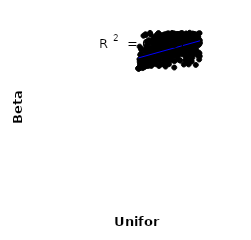
| Category | Series 0 |
|---|---|
| 151.58662230469125 | 36.958 |
| 117.02366175498116 | 36.734 |
| 141.4622938112055 | 40.559 |
| 140.04481939467075 | 40.18 |
| 138.54682849161816 | 40.958 |
| 114.3937213328714 | 36.178 |
| 111.9688835244239 | 38.92 |
| 154.23147277150008 | 43.843 |
| 108.42089313407557 | 37.828 |
| 121.60663631891065 | 41.712 |
| 137.001413410114 | 40.652 |
| 153.71407965694323 | 43.094 |
| 130.953628019818 | 42.838 |
| 137.8433108642392 | 40.185 |
| 114.67230462280449 | 39.768 |
| 139.254163358308 | 39.957 |
| 149.5701239956246 | 41.96 |
| 133.52875895147798 | 42.384 |
| 145.3219372055374 | 40.41 |
| 141.1928729245958 | 41.929 |
| 133.86503710598365 | 40.575 |
| 132.29333464374923 | 40.783 |
| 128.93570748829694 | 43.222 |
| 126.15059682240863 | 35.931 |
| 158.08882277802542 | 38.447 |
| 149.08031780903394 | 43.501 |
| 136.3329241079614 | 41.806 |
| 116.41255291665382 | 36.607 |
| 115.49649882743664 | 36.248 |
| 132.06005435090202 | 40.743 |
| 126.00508338681331 | 39.625 |
| 156.80155260295928 | 39.402 |
| 108.78196619002767 | 41.864 |
| 151.808604515911 | 37.595 |
| 123.06967446008183 | 39.716 |
| 106.119097633572 | 36.385 |
| 153.45562445195057 | 40.146 |
| 103.47065402841946 | 35.902 |
| 122.478109245833 | 41.161 |
| 140.60853881658528 | 37.248 |
| 146.70241842897883 | 37.664 |
| 123.92320524545396 | 41.364 |
| 134.06616891283485 | 40.7 |
| 148.60029297280818 | 38.226 |
| 124.88792561904154 | 41.711 |
| 116.85124174958747 | 42.204 |
| 159.60431633918424 | 37.382 |
| 132.47978972670376 | 37.848 |
| 147.92368566363774 | 43.501 |
| 107.35222295221547 | 37.355 |
| 155.34974182683015 | 39.546 |
| 122.96729861850233 | 43.194 |
| 146.87760657206462 | 38.073 |
| 151.44616522288106 | 43.726 |
| 143.60598700343752 | 42.263 |
| 127.3651615808546 | 42.853 |
| 146.13990437948104 | 42.087 |
| 122.13348809732918 | 42.696 |
| 146.3784054526746 | 37.079 |
| 141.87764462293603 | 42.322 |
| 121.03890436650336 | 37.799 |
| 140.9531317034082 | 39.445 |
| 125.52298814488245 | 43.625 |
| 101.32036258354088 | 35.166 |
| 109.46405868303056 | 36.621 |
| 150.81827046183284 | 38.688 |
| 148.25156817429348 | 43.401 |
| 124.29297364957225 | 38.643 |
| 121.47852402757475 | 37.128 |
| 109.98323734713952 | 36.441 |
| 149.7029855441926 | 41.361 |
| 105.4213727370216 | 37.964 |
| 138.2397512346903 | 38.256 |
| 101.08416524071903 | 35.099 |
| 125.84143945363542 | 39.577 |
| 135.90676135191632 | 36.977 |
| 119.35167467539978 | 39.095 |
| 135.36683302019281 | 44.036 |
| 121.93522390675261 | 42.847 |
| 128.16302346775868 | 41.893 |
| 120.30478521486637 | 40.391 |
| 148.55841964791068 | 43.418 |
| 139.4502643846024 | 43.343 |
| 124.57215566175644 | 41.257 |
| 155.64808240936648 | 42.203 |
| 118.53541247721753 | 37.561 |
| 151.02805538598574 | 40.163 |
| 115.71544281627449 | 43.051 |
| 132.82479306592532 | 39.31 |
| 129.536856654268 | 42.754 |
| 122.81125549736561 | 38.213 |
| 155.228358779723 | 43.28 |
| 117.45102276058799 | 43.11 |
| 130.78695648682475 | 37.688 |
| 132.42606245281831 | 43.86 |
| 154.66718948064377 | 43.889 |
| 122.06993177993553 | 36.077 |
| 122.67616287322589 | 43.271 |
| 119.07411628484087 | 41.328 |
| 121.13209332623866 | 39.186 |
| 115.0139581605669 | 38.938 |
| 137.30645537757508 | 40.554 |
| 100.91505817604192 | 35.085 |
| 158.91759964178874 | 41.066 |
| 147.45121055679738 | 42.581 |
| 155.90770291185535 | 39.507 |
| 138.12092981468908 | 38.429 |
| 132.11321418604717 | 39.7 |
| 133.10942454992232 | 40.707 |
| 101.88301232729307 | 37.423 |
| 157.27943849399426 | 43.338 |
| 125.75855081140696 | 39.265 |
| 126.89507557119879 | 37.765 |
| 144.94898320540008 | 41.273 |
| 155.75660786086172 | 42.966 |
| 141.65303355792307 | 39.434 |
| 105.91227618221703 | 36.683 |
| 122.35931852301326 | 42.035 |
| 130.08984277217016 | 38.406 |
| 128.75371361528977 | 40.583 |
| 148.34442213449796 | 36.384 |
| 103.22824038175337 | 36.424 |
| 139.5710368196299 | 43.862 |
| 106.19866203186267 | 37.254 |
| 134.2120527561547 | 39.104 |
| 136.60954237848986 | 38.317 |
| 140.8848481051661 | 40.164 |
| 149.44990854988134 | 36.124 |
| 103.5689535632133 | 38.934 |
| 112.2997307194285 | 37.173 |
| 102.05105420367123 | 40.662 |
| 135.13016491669896 | 42.687 |
| 121.72947291574019 | 39.742 |
| 114.1551923159175 | 36.516 |
| 117.58176020153672 | 41.784 |
| 111.1400867732507 | 39.104 |
| 127.99551988690257 | 41.738 |
| 145.1483697699441 | 39.191 |
| 159.54139163875584 | 42.187 |
| 142.59061412825744 | 41.559 |
| 141.9661062080536 | 44.06 |
| 154.03751815755416 | 42.443 |
| 115.99678716196627 | 37.905 |
| 117.06658627419644 | 37.037 |
| 136.98948004400904 | 41.297 |
| 129.86160509755555 | 36.64 |
| 159.94007260290758 | 44.093 |
| 158.36219606811042 | 41.966 |
| 119.19823053475498 | 38.119 |
| 101.69453446313864 | 35.288 |
| 131.20136207194668 | 42.562 |
| 106.77153111670388 | 35.916 |
| 119.21344259147436 | 43.74 |
| 132.62171707444702 | 40.7 |
| 107.97320202730913 | 37.195 |
| 130.54458588030832 | 42.969 |
| 132.76617391594007 | 41.32 |
| 158.75161663415227 | 42.535 |
| 149.2884276524941 | 41.208 |
| 142.67087117525335 | 39.92 |
| 128.776727026537 | 36.95 |
| 129.21576255670442 | 37.168 |
| 110.45973454655338 | 39.888 |
| 118.82158931655852 | 40.788 |
| 155.14307975481117 | 43.834 |
| 102.86289483667758 | 35.608 |
| 106.80786533695773 | 35.468 |
| 136.1520624337956 | 40.792 |
| 107.98709582020662 | 43.606 |
| 145.5447384408859 | 39.213 |
| 111.63172470300597 | 38.721 |
| 131.94282466953655 | 37.291 |
| 151.24526971229176 | 39.943 |
| 131.28352207647904 | 42.529 |
| 108.10698876845873 | 37.155 |
| 142.384537806102 | 41.425 |
| 147.0275089056367 | 37.154 |
| 111.86127096988542 | 37.477 |
| 159.6935308827816 | 41.778 |
| 124.6394364896577 | 40.632 |
| 101.22856795476362 | 35.132 |
| 154.48824002221357 | 38.811 |
| 102.6796128498152 | 38.578 |
| 151.42501608394292 | 43.326 |
| 116.47485469041813 | 41.063 |
| 143.31454226873524 | 42.847 |
| 131.5837180520668 | 38.534 |
| 151.9843090168883 | 36.975 |
| 146.9865219846219 | 44.015 |
| 124.74114544179774 | 40.018 |
| 139.8854285622441 | 38.929 |
| 104.87799833020475 | 36.168 |
| 117.68353442510812 | 40.145 |
| 136.86849508829016 | 39.257 |
| 126.1163610059692 | 43.312 |
| 102.75886771905466 | 37.46 |
| 108.88307221430803 | 36.747 |
| 104.28604480401643 | 36.099 |
| 119.69164034931637 | 41.161 |
| 146.55896577170574 | 40.883 |
| 108.57910453380097 | 37.763 |
| 112.55155848390957 | 37.416 |
| 150.66865035448015 | 40.973 |
| 144.0391511356472 | 41.708 |
| 148.97475151033112 | 41.59 |
| 120.06832395483562 | 38.348 |
| 135.52565173964638 | 35.332 |
| 105.13433688975967 | 36.273 |
| 156.68898704405944 | 42.665 |
| 107.4641051427658 | 36.514 |
| 115.88266439122606 | 42.629 |
| 105.52040745329293 | 36.626 |
| 159.27073215997785 | 42.409 |
| 144.82081853217642 | 42.856 |
| 137.40536454544448 | 40.584 |
| 145.03690880720325 | 40.189 |
| 149.41157461268003 | 36.67 |
| 130.34523707450177 | 36.18 |
| 120.58227557123203 | 40.55 |
| 153.53704914871014 | 42.871 |
| 104.10844050002189 | 37.213 |
| 157.7528754016516 | 41.414 |
| 125.33114210948762 | 39.316 |
| 156.3529066017246 | 35.992 |
| 101.60911180769003 | 35.153 |
| 147.86053559737093 | 41.001 |
| 146.00756736160918 | 38.716 |
| 101.04794908447339 | 35.09 |
| 102.44019355268856 | 35.224 |
| 140.36443142746202 | 42.653 |
| 111.33051793177951 | 40.202 |
| 121.36159193319575 | 41.195 |
| 113.7613741652395 | 35.968 |
| 133.9451738078719 | 39.194 |
| 106.02010013860895 | 36.036 |
| 151.72344877473142 | 41.759 |
| 112.16403177068868 | 40.433 |
| 156.03836996703842 | 43.444 |
| 145.89173439174172 | 42.306 |
| 124.18675312598836 | 41.045 |
| 146.54204203601066 | 41.965 |
| 152.53815283697418 | 40.886 |
| 148.76331314143061 | 42.532 |
| 109.04998482882917 | 36.374 |
| 116.31731616096403 | 37.483 |
| 144.32363249311416 | 38.866 |
| 125.10962526140716 | 42.03 |
| 106.64842911444917 | 36.102 |
| 159.15405430744212 | 39.151 |
| 115.0645010266322 | 40.298 |
| 128.63451063854936 | 41.504 |
| 107.02497617564624 | 36.135 |
| 156.9987948611144 | 39.285 |
| 108.62918196361302 | 40.805 |
| 112.83413286802195 | 39.043 |
| 104.47012626205924 | 37.95 |
| 157.99229981088854 | 42.8 |
| 103.44378169799246 | 39.993 |
| 143.91208676304097 | 43.624 |
| 134.3313529445006 | 42.408 |
| 117.98666725209506 | 41.212 |
| 127.47301114547506 | 40.934 |
| 144.5896295935416 | 43.146 |
| 159.39517808076454 | 41.163 |
| 123.80702717776896 | 40.776 |
| 126.42959940760788 | 37.2 |
| 152.87164305397562 | 40.479 |
| 152.29694889991072 | 36.868 |
| 138.00267017168446 | 43.879 |
| 147.71734470011177 | 39.409 |
| 128.51313228624704 | 43.961 |
| 134.54359247682183 | 37.109 |
| 154.32031144387088 | 43.282 |
| 113.28330038448901 | 35.735 |
| 137.80695574385007 | 43.271 |
| 117.84844435556225 | 37.788 |
| 150.49166413547758 | 38.899 |
| 154.73209927270094 | 40.19 |
| 104.2376494493162 | 36.557 |
| 112.40763091253643 | 36.855 |
| 137.15571214418208 | 39.491 |
| 118.33784833503339 | 42.667 |
| 119.5955484436477 | 39.157 |
| 145.82470642191197 | 43.232 |
| 140.1284742937491 | 40.859 |
| 111.23096308346372 | 36.186 |
| 137.56502878816124 | 41.73 |
| 156.1489961637179 | 41.766 |
| 153.0476929972122 | 37.848 |
| 129.81572902736866 | 44.053 |
| 113.58554847370158 | 39.347 |
| 155.50730411764897 | 42.263 |
| 133.0084179979695 | 42.058 |
| 124.42445230178612 | 38.022 |
| 130.5628502262545 | 40.622 |
| 129.27961320887624 | 41.315 |
| 116.77300861772481 | 39.926 |
| 145.66337480132063 | 42.399 |
| 157.39693064652494 | 41.788 |
| 117.38904242688703 | 37.082 |
| 142.1092193065715 | 42.913 |
| 140.28163999942444 | 40.953 |
| 156.26547448980057 | 40.781 |
| 110.30207943499673 | 41.354 |
| 111.77780769575556 | 38.714 |
| 114.0277222666988 | 36.391 |
| 126.55467154412975 | 38.159 |
| 112.92803273654502 | 39.811 |
| 121.3219741327282 | 39.871 |
| 107.68848305174687 | 43.805 |
| 124.09846688490065 | 36.306 |
| 127.57820745678903 | 40.68 |
| 151.11223722579598 | 41.352 |
| 127.25711718678212 | 39.86 |
| 160.21212414338694 | 42.233 |
| 157.5807296088554 | 42.842 |
| 153.63560264320523 | 39.37 |
| 105.24904382990684 | 36.002 |
| 139.67386949895698 | 43.821 |
| 110.53294410956296 | 41.816 |
| 136.75285838885887 | 39.755 |
| 122.2791391047895 | 36.251 |
| 107.13900301049422 | 39.456 |
| 142.87093370320554 | 41.464 |
| 150.9564026856488 | 39.22 |
| 118.18104156315579 | 37.365 |
| 109.17230062886117 | 35.898 |
| 104.64034460247964 | 36.642 |
| 126.79550516487502 | 40.362 |
| 139.36550932020913 | 41.868 |
| 160.29622896288313 | 41.559 |
| 105.78567793830594 | 43.438 |
| 134.74617732943744 | 43.878 |
| 145.37232889053607 | 41.034 |
| 105.10596108749243 | 35.182 |
| 126.33124544354123 | 43.807 |
| 102.60881562177009 | 35.585 |
| 119.46878053485322 | 39.877 |
| 149.93175665177935 | 44.009 |
| 110.83035748654902 | 36.019 |
| 107.77419841570267 | 35.663 |
| 136.4052242056436 | 38.609 |
| 123.23896351718153 | 39.281 |
| 114.24452763335383 | 37.925 |
| 131.76861393798447 | 43.193 |
| 107.55582615494724 | 38.281 |
| 129.06013732826926 | 38.837 |
| 104.96475109804864 | 36.837 |
| 103.71764463433149 | 40.077 |
| 129.38761179714595 | 42.898 |
| 135.7655967740438 | 42.318 |
| 130.20564357990847 | 38.242 |
| 143.0583238002518 | 44.11 |
| 113.65190798189187 | 37.733 |
| 147.24214385874808 | 42.798 |
| 127.68945741557755 | 41.543 |
| 110.05077182357688 | 40.587 |
| 111.47410734029 | 39.767 |
| 144.7468743446619 | 36.099 |
| 140.49461559573353 | 41.087 |
| 154.78871300727127 | 43.695 |
| 126.70243908488268 | 40.996 |
| 102.35081454672367 | 36.163 |
| 118.8589709959806 | 43.699 |
| 119.93668697865635 | 38.921 |
| 109.3959294442267 | 37.664 |
| 108.28461498144982 | 35.692 |
| 118.10521154139062 | 36.165 |
| 120.93778052240876 | 43.323 |
| 128.07025951557358 | 41.947 |
| 143.7701203972768 | 43.144 |
| 146.19441788135978 | 41.135 |
| 113.1650306007471 | 42.142 |
| 123.6115791056186 | 38.527 |
| 157.8745912145891 | 41.409 |
| 156.5484873110769 | 39.993 |
| 131.63963301159492 | 38.267 |
| 114.80220923590637 | 40.554 |
| 114.62121778162589 | 36.72 |
| 120.77454349574222 | 35.73 |
| 147.6186638774323 | 42.322 |
| 150.1463628490374 | 41.144 |
| 152.2484317897543 | 38.573 |
| 106.48612226990446 | 35.813 |
| 150.4299285502329 | 44.188 |
| 144.26431310533522 | 43.68 |
| 150.35971317143628 | 43.559 |
| 158.6974988748694 | 43.13 |
| 148.92898590063584 | 38.282 |
| 157.50831459150936 | 43.222 |
| 135.0181373441298 | 42.788 |
| 156.93667812320317 | 41.224 |
| 158.45511147702675 | 42.9 |
| 139.02859565882613 | 41.323 |
| 119.85268870466415 | 38.849 |
| 131.1009957465014 | 38.581 |
| 137.6056910511817 | 40.285 |
| 115.23888006022929 | 39.369 |
| 150.02024714200834 | 36.985 |
| 116.6158793013185 | 41.232 |
| 147.3275757038689 | 39.6 |
| 144.51295304435016 | 39.986 |
| 120.45262949445853 | 41.936 |
| 122.59311037322384 | 42.26 |
| 133.57342079348146 | 39.913 |
| 155.47526846476157 | 41.826 |
| 103.02822195574325 | 38.605 |
| 125.20649303362782 | 40.682 |
| 130.06513050254688 | 42.383 |
| 127.09159191908594 | 35.573 |
| 143.12979572914122 | 38.672 |
| 110.15400909020207 | 38.91 |
| 103.90508812927136 | 35.86 |
| 144.07777879586035 | 40.066 |
| 136.17149731797883 | 43.205 |
| 120.26732592557612 | 44.127 |
| 142.1964014014985 | 38.975 |
| 158.54974015874717 | 43.946 |
| 136.03761790209688 | 41.56 |
| 123.66827226267134 | 39.372 |
| 127.06626873033225 | 39.18 |
| 128.34196304893976 | 37.172 |
| 125.61807000545625 | 37.217 |
| 129.67341180010072 | 40.53 |
| 139.00331950827606 | 38.35 |
| 101.50828724259983 | 35.126 |
| 138.63351831455532 | 42.417 |
| 106.42015807313234 | 35.902 |
| 152.48520021992465 | 41.148 |
| 109.24573995488741 | 37.029 |
| 159.84102411591672 | 38.951 |
| 110.985021147687 | 37.371 |
| 107.1912950388027 | 39.801 |
| 134.45694894852227 | 38.659 |
| 133.2833173209676 | 42.305 |
| 148.05696951957177 | 40.3 |
| 102.14001328684107 | 36.766 |
| 135.28899070257353 | 43.047 |
| 117.20999380807285 | 36.523 |
| 112.12758220326295 | 44.152 |
| 160.12562660770496 | 38.223 |
| 103.99366580256924 | 35.794 |
| 123.46974115257154 | 43.596 |
| 112.7522488364373 | 43.704 |
| 113.45220437073755 | 36.739 |
| 109.61381818136765 | 40.106 |
| 133.39255852528572 | 44.143 |
| 113.86878123056306 | 36.123 |
| 118.4244474708811 | 42.129 |
| 127.90693169564949 | 40.223 |
| 118.65877319586109 | 39.604 |
| 134.85049961008332 | 38.243 |
| 109.8146217131971 | 35.777 |
| 110.93597949009887 | 35.781 |
| 154.133288250195 | 42.592 |
| 115.28641292545042 | 37.245 |
| 124.98100499773757 | 42.487 |
| 133.71968818955122 | 40.051 |
| 116.18870199958438 | 39.457 |
| 115.58974311402267 | 40.789 |
| 142.8313665131555 | 43.501 |
| 152.9873219957528 | 42.907 |
| 141.655485513751 | 43.036 |
| 140.80085821025432 | 39.492 |
| 158.9978746874084 | 38.896 |
| 153.9124165858309 | 42.698 |
| 153.21393757465518 | 43.991 |
| 130.8156326240508 | 39.583 |
| 135.63255841927827 | 43.365 |
| 134.6599320726978 | 39.34 |
| 131.497717861565 | 39.447 |
| 141.10770189731986 | 39.436 |
| 158.2017888228091 | 41.52 |
| 143.38405014880067 | 43.498 |
| 115.84104618292596 | 36.733 |
| 154.99102990417504 | 40.3 |
| 114.44773724926691 | 41.503 |
| 139.85637213356705 | 43.494 |
| 113.06065818990056 | 38.471 |
| 138.68459857839792 | 37.422 |
| 141.40485132590544 | 37.068 |
| 143.50031847637285 | 42.192 |
| 120.70661390607273 | 43.729 |
| 152.67601946282235 | 40.816 |
| 138.83872287396488 | 43.879 |
| 110.68526655767339 | 42.306 |
| 149.7921941294483 | 43.267 |
| 157.15596714708624 | 42.865 |
| 123.35033816146063 | 40.593 |
| 100.81924212561586 | 35.094 |
| 104.62970817655639 | 36.788 |
| 109.69654503252855 | 39.06 |
| 152.0805110895086 | 42.028 |
| 148.19488730427543 | 40.457 |
| 103.14635247879926 | 36.49 |
| 101.91168156142298 | 35.326 |
| 138.3579234098986 | 39.559 |
| 105.67333771855652 | 36.048 |
| 153.29515834708843 | 43.717 |
| 142.36540023738291 | 41.106 |